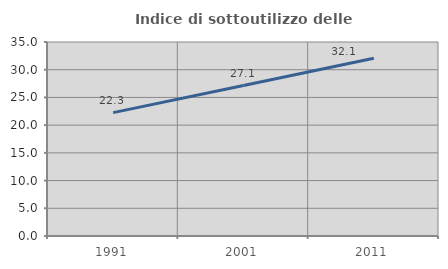
| Category | Indice di sottoutilizzo delle abitazioni  |
|---|---|
| 1991.0 | 22.26 |
| 2001.0 | 27.146 |
| 2011.0 | 32.079 |